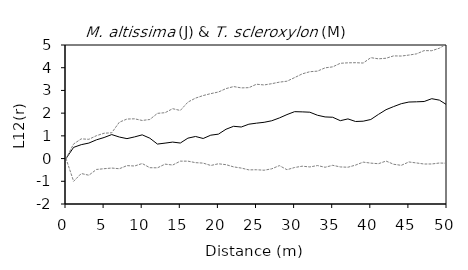
| Category | L12(r) | E12- | E12+ |
|---|---|---|---|
| 0.0 | 0 | 0 | 0 |
| 1.0 | 0.493 | -1 | 0.643 |
| 2.0 | 0.612 | -0.658 | 0.867 |
| 3.0 | 0.682 | -0.733 | 0.848 |
| 4.0 | 0.825 | -0.48 | 1.008 |
| 5.0 | 0.927 | -0.446 | 1.116 |
| 6.0 | 1.057 | -0.417 | 1.135 |
| 7.0 | 0.949 | -0.448 | 1.601 |
| 8.0 | 0.878 | -0.311 | 1.741 |
| 9.0 | 0.954 | -0.327 | 1.75 |
| 10.0 | 1.044 | -0.218 | 1.678 |
| 11.0 | 0.897 | -0.402 | 1.721 |
| 12.0 | 0.638 | -0.407 | 1.991 |
| 13.0 | 0.68 | -0.245 | 2.02 |
| 14.0 | 0.726 | -0.284 | 2.196 |
| 15.0 | 0.684 | -0.114 | 2.118 |
| 16.0 | 0.899 | -0.113 | 2.486 |
| 17.0 | 0.972 | -0.18 | 2.661 |
| 18.0 | 0.884 | -0.2 | 2.774 |
| 19.0 | 1.03 | -0.304 | 2.859 |
| 20.0 | 1.075 | -0.229 | 2.93 |
| 21.0 | 1.291 | -0.269 | 3.081 |
| 22.0 | 1.421 | -0.366 | 3.17 |
| 23.0 | 1.389 | -0.418 | 3.112 |
| 24.0 | 1.513 | -0.498 | 3.122 |
| 25.0 | 1.559 | -0.492 | 3.273 |
| 26.0 | 1.597 | -0.513 | 3.241 |
| 27.0 | 1.665 | -0.451 | 3.297 |
| 28.0 | 1.789 | -0.31 | 3.364 |
| 29.0 | 1.937 | -0.49 | 3.406 |
| 30.0 | 2.065 | -0.393 | 3.565 |
| 31.0 | 2.056 | -0.335 | 3.728 |
| 32.0 | 2.041 | -0.369 | 3.824 |
| 33.0 | 1.908 | -0.307 | 3.85 |
| 34.0 | 1.833 | -0.383 | 3.994 |
| 35.0 | 1.819 | -0.297 | 4.038 |
| 36.0 | 1.668 | -0.368 | 4.195 |
| 37.0 | 1.746 | -0.381 | 4.215 |
| 38.0 | 1.632 | -0.287 | 4.221 |
| 39.0 | 1.646 | -0.157 | 4.206 |
| 40.0 | 1.72 | -0.2 | 4.443 |
| 41.0 | 1.944 | -0.226 | 4.391 |
| 42.0 | 2.152 | -0.11 | 4.417 |
| 43.0 | 2.29 | -0.251 | 4.521 |
| 44.0 | 2.416 | -0.298 | 4.514 |
| 45.0 | 2.489 | -0.149 | 4.557 |
| 46.0 | 2.499 | -0.193 | 4.61 |
| 47.0 | 2.513 | -0.24 | 4.753 |
| 48.0 | 2.636 | -0.238 | 4.748 |
| 49.0 | 2.573 | -0.196 | 4.858 |
| 50.0 | 2.361 | -0.205 | 5.059 |